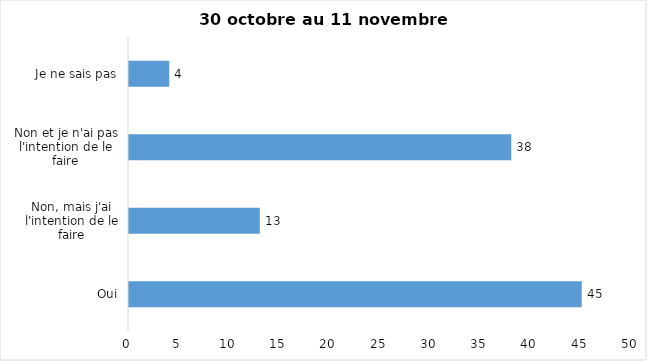
| Category | Series 0 |
|---|---|
| Oui | 45 |
| Non, mais j'ai l'intention de le faire | 13 |
| Non et je n'ai pas l'intention de le faire | 38 |
| Je ne sais pas | 4 |